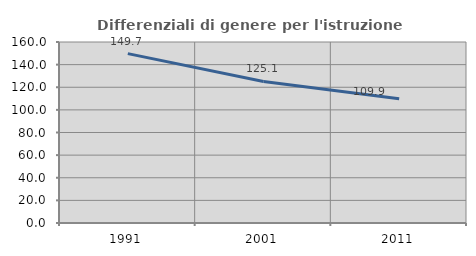
| Category | Differenziali di genere per l'istruzione superiore |
|---|---|
| 1991.0 | 149.708 |
| 2001.0 | 125.132 |
| 2011.0 | 109.922 |